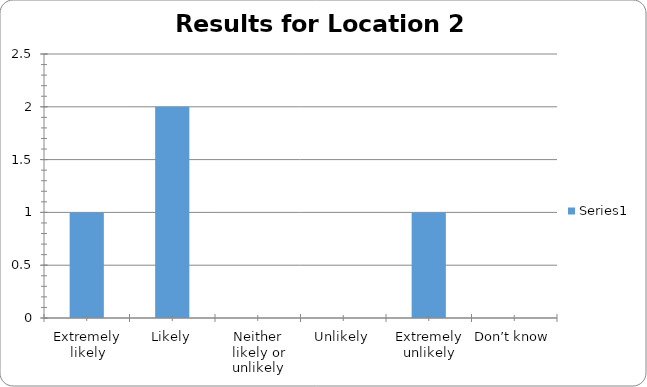
| Category | Series 0 |
|---|---|
| Extremely likely | 1 |
| Likely | 2 |
| Neither likely or unlikely | 0 |
| Unlikely | 0 |
| Extremely unlikely | 1 |
| Don’t know | 0 |